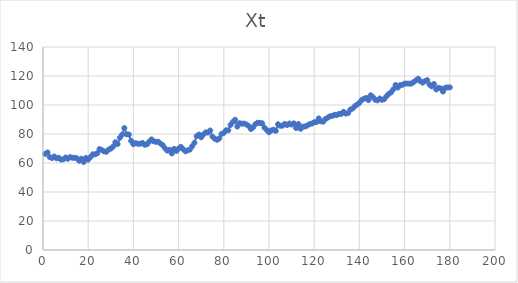
| Category | Xt |
|---|---|
| 0 | 66.267 |
| 1 | 67.299 |
| 2 | 64.096 |
| 3 | 63.442 |
| 4 | 64.517 |
| 5 | 63.214 |
| 6 | 63.57 |
| 7 | 62.37 |
| 8 | 62.54 |
| 9 | 63.803 |
| 10 | 62.914 |
| 11 | 64.072 |
| 12 | 63.569 |
| 13 | 63.628 |
| 14 | 63.247 |
| 15 | 61.546 |
| 16 | 62.975 |
| 17 | 60.724 |
| 18 | 63.491 |
| 19 | 62.294 |
| 20 | 64.094 |
| 21 | 66.003 |
| 22 | 65.918 |
| 23 | 66.681 |
| 24 | 69.612 |
| 25 | 68.977 |
| 26 | 67.994 |
| 27 | 67.726 |
| 28 | 69.176 |
| 29 | 69.924 |
| 30 | 71.258 |
| 31 | 74.315 |
| 32 | 73.014 |
| 33 | 77.401 |
| 34 | 79.483 |
| 35 | 84.082 |
| 36 | 79.799 |
| 37 | 79.643 |
| 38 | 75.246 |
| 39 | 72.925 |
| 40 | 73.725 |
| 41 | 73.245 |
| 42 | 73.276 |
| 43 | 73.874 |
| 44 | 72.565 |
| 45 | 72.888 |
| 46 | 74.67 |
| 47 | 76.3 |
| 48 | 74.93 |
| 49 | 74.595 |
| 50 | 74.616 |
| 51 | 73.41 |
| 52 | 72.278 |
| 53 | 70.157 |
| 54 | 68.536 |
| 55 | 69.124 |
| 56 | 66.572 |
| 57 | 69.757 |
| 58 | 68.297 |
| 59 | 69.926 |
| 60 | 71.12 |
| 61 | 69.561 |
| 62 | 68.058 |
| 63 | 68.666 |
| 64 | 69.252 |
| 65 | 71.558 |
| 66 | 73.945 |
| 67 | 78.526 |
| 68 | 79.607 |
| 69 | 77.704 |
| 70 | 79.701 |
| 71 | 81.108 |
| 72 | 80.967 |
| 73 | 82.417 |
| 74 | 78.195 |
| 75 | 76.746 |
| 76 | 76.003 |
| 77 | 76.918 |
| 78 | 80.029 |
| 79 | 80.755 |
| 80 | 82.574 |
| 81 | 82.511 |
| 82 | 86.318 |
| 83 | 88.265 |
| 84 | 89.811 |
| 85 | 85.103 |
| 86 | 87.469 |
| 87 | 87.092 |
| 88 | 87.206 |
| 89 | 86.556 |
| 90 | 85.566 |
| 91 | 83.441 |
| 92 | 84.671 |
| 93 | 86.758 |
| 94 | 87.792 |
| 95 | 87.599 |
| 96 | 87.368 |
| 97 | 84.332 |
| 98 | 82.772 |
| 99 | 81.226 |
| 100 | 82.496 |
| 101 | 82.982 |
| 102 | 82.191 |
| 103 | 86.697 |
| 104 | 85.669 |
| 105 | 85.761 |
| 106 | 86.96 |
| 107 | 86.165 |
| 108 | 87.216 |
| 109 | 86.495 |
| 110 | 87.342 |
| 111 | 84.095 |
| 112 | 86.882 |
| 113 | 83.604 |
| 114 | 85.08 |
| 115 | 85.197 |
| 116 | 85.873 |
| 117 | 86.845 |
| 118 | 87.216 |
| 119 | 88.123 |
| 120 | 88.149 |
| 121 | 90.779 |
| 122 | 88.685 |
| 123 | 88.484 |
| 124 | 90.386 |
| 125 | 91.312 |
| 126 | 92.178 |
| 127 | 92.532 |
| 128 | 93.26 |
| 129 | 93.1 |
| 130 | 93.85 |
| 131 | 93.852 |
| 132 | 95.272 |
| 133 | 94.076 |
| 134 | 94.426 |
| 135 | 96.797 |
| 136 | 97.588 |
| 137 | 99.226 |
| 138 | 100.281 |
| 139 | 101.505 |
| 140 | 103.403 |
| 141 | 104.305 |
| 142 | 104.885 |
| 143 | 103.34 |
| 144 | 106.706 |
| 145 | 105.427 |
| 146 | 103.593 |
| 147 | 103.197 |
| 148 | 104.483 |
| 149 | 103.589 |
| 150 | 104.056 |
| 151 | 106.037 |
| 152 | 107.629 |
| 153 | 108.761 |
| 154 | 110.801 |
| 155 | 113.823 |
| 156 | 112.068 |
| 157 | 113.651 |
| 158 | 113.908 |
| 159 | 114.792 |
| 160 | 114.763 |
| 161 | 114.734 |
| 162 | 114.774 |
| 163 | 115.766 |
| 164 | 117.004 |
| 165 | 118.147 |
| 166 | 116.346 |
| 167 | 115.419 |
| 168 | 116.499 |
| 169 | 117.15 |
| 170 | 114.125 |
| 171 | 112.839 |
| 172 | 114.487 |
| 173 | 110.72 |
| 174 | 111.882 |
| 175 | 111.455 |
| 176 | 109.247 |
| 177 | 111.884 |
| 178 | 112.114 |
| 179 | 112.149 |